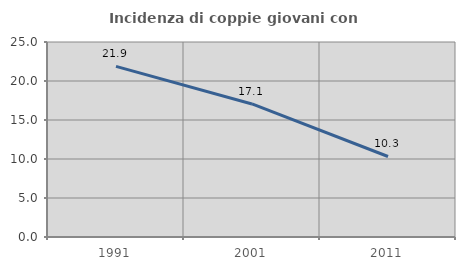
| Category | Incidenza di coppie giovani con figli |
|---|---|
| 1991.0 | 21.879 |
| 2001.0 | 17.059 |
| 2011.0 | 10.323 |